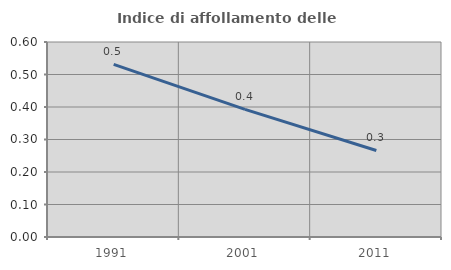
| Category | Indice di affollamento delle abitazioni  |
|---|---|
| 1991.0 | 0.531 |
| 2001.0 | 0.393 |
| 2011.0 | 0.266 |